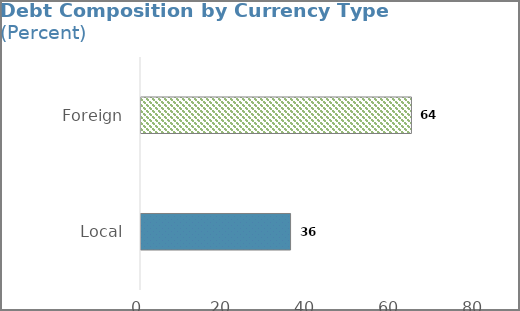
| Category | Series 0 |
|---|---|
| Local | 35.613 |
| Foreign | 64.387 |